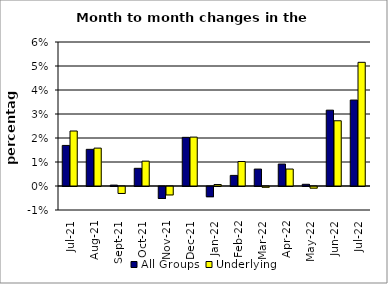
| Category | All Groups | Underlying |
|---|---|---|
| 2021-07-01 | 0.017 | 0.023 |
| 2021-08-01 | 0.015 | 0.016 |
| 2021-09-01 | 0 | -0.003 |
| 2021-10-01 | 0.007 | 0.01 |
| 2021-11-01 | -0.005 | -0.004 |
| 2021-12-01 | 0.02 | 0.02 |
| 2022-01-01 | -0.004 | 0.001 |
| 2022-02-01 | 0.004 | 0.01 |
| 2022-03-01 | 0.007 | 0 |
| 2022-04-01 | 0.009 | 0.007 |
| 2022-05-01 | 0.001 | -0.001 |
| 2022-06-01 | 0.032 | 0.027 |
| 2022-07-01 | 0.036 | 0.052 |